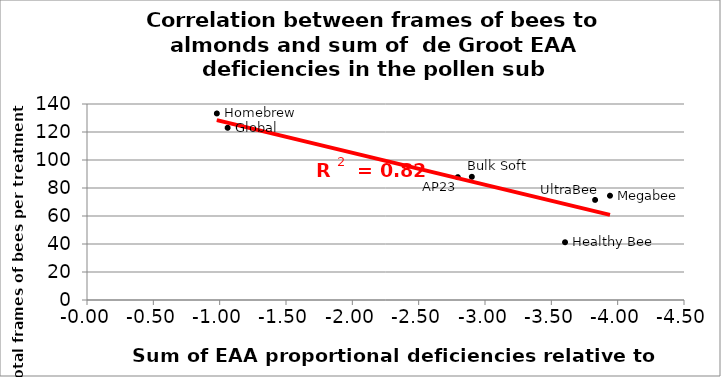
| Category | FOB to almonds |
|---|---|
| 1.060068881685575 | 123 |
| 0.9786988110964332 | 133.25 |
| 2.90074481865285 | 88 |
| 2.7949080622347946 | 87.75 |
| 3.942002442002442 | 74.5 |
| 3.8298248882265282 | 71.5 |
| 3.6034015653220948 | 41.25 |